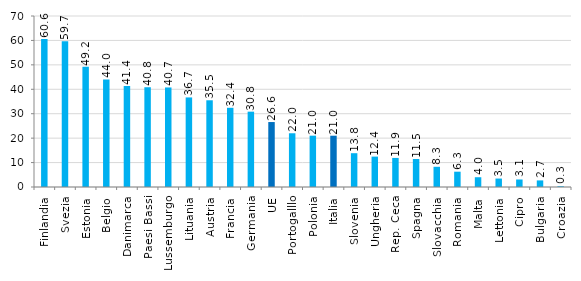
| Category | Series 0 |
|---|---|
| Finlandia | 60.613 |
| Svezia | 59.665 |
| Estonia | 49.228 |
| Belgio | 44.008 |
| Danimarca | 41.35 |
| Paesi Bassi | 40.84 |
| Lussemburgo | 40.748 |
| Lituania | 36.667 |
| Austria | 35.5 |
| Francia | 32.417 |
| Germania | 30.842 |
| UE | 26.591 |
| Portogalllo | 21.995 |
| Polonia | 21.011 |
| Italia | 20.997 |
| Slovenia | 13.834 |
| Ungheria | 12.444 |
| Rep. Ceca | 11.896 |
| Spagna | 11.469 |
| Slovacchia | 8.271 |
| Romania | 6.268 |
| Malta | 4 |
| Lettonia | 3.456 |
| Cipro | 3.077 |
| Bulgaria | 2.699 |
| Croazia | 0.314 |